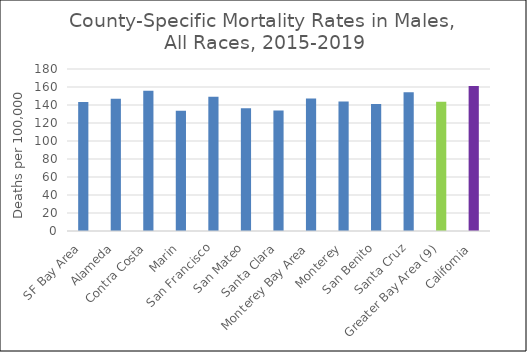
| Category | Male |
|---|---|
| SF Bay Area | 143.26 |
|   Alameda | 146.83 |
|   Contra Costa | 155.78 |
|   Marin | 133.64 |
|   San Francisco | 149.28 |
|   San Mateo | 136.36 |
|   Santa Clara | 133.94 |
| Monterey Bay Area | 147.1 |
|   Monterey | 143.81 |
|   San Benito | 141 |
|   Santa Cruz | 154.06 |
| Greater Bay Area (9) | 143.62 |
| California | 161.05 |